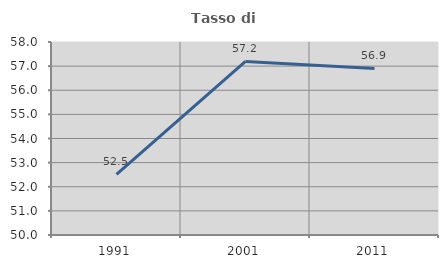
| Category | Tasso di occupazione   |
|---|---|
| 1991.0 | 52.509 |
| 2001.0 | 57.194 |
| 2011.0 | 56.902 |